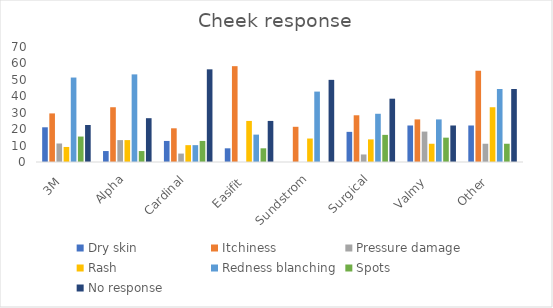
| Category | Dry skin | Itchiness | Pressure damage | Rash | Redness blanching | Spots | No response |
|---|---|---|---|---|---|---|---|
| 3M  | 21.127 | 29.577 | 11.268 | 9.155 | 51.408 | 15.493 | 22.535 |
| Alpha | 6.667 | 33.333 | 13.333 | 13.333 | 53.333 | 6.667 | 26.667 |
| Cardinal | 12.821 | 20.513 | 5.128 | 10.256 | 10.256 | 12.821 | 56.41 |
| Easifit  | 8.333 | 58.333 | 0 | 25 | 16.667 | 8.333 | 25 |
| Sundstrom | 0 | 21.429 | 0 | 14.286 | 42.857 | 0 | 50 |
| Surgical | 18.349 | 28.44 | 4.587 | 13.761 | 29.358 | 16.514 | 38.532 |
| Valmy  | 22.222 | 25.926 | 18.519 | 11.111 | 25.926 | 14.815 | 22.222 |
| Other  | 22.222 | 55.556 | 11.111 | 33.333 | 44.444 | 11.111 | 44.444 |